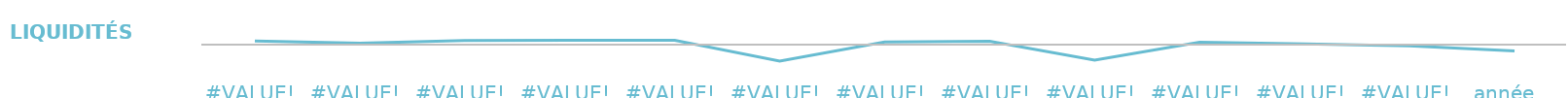
| Category | Liquidités |
|---|---|
| #VALUE! | 169 |
| #VALUE! | 69 |
| #VALUE! | 192 |
| #VALUE! | 199 |
| #VALUE! | 204 |
| #VALUE! | -771 |
| #VALUE! | 124 |
| #VALUE! | 154 |
| #VALUE! | -721 |
| #VALUE! | 109 |
| #VALUE! | 34 |
| #VALUE! | -61 |
| année   | -299 |